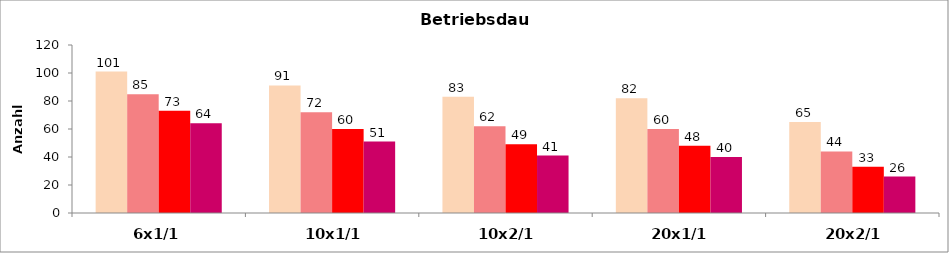
| Category | bis 6° dH | bis 11° dH | bis 17° dH | bis 22°dH |
|---|---|---|---|---|
| 6x1/1 | 101.01 | 84.746 | 72.993 | 64.02 |
| 10x1/1 | 91.075 | 72.046 | 60.024 | 51.02 |
| 10x2/1 | 83.056 | 62.035 | 49.068 | 40.984 |
| 20x1/1 | 81.967 | 60.024 | 47.985 | 40 |
| 20x2/1 | 65.02 | 44.014 | 33.003 | 26.001 |